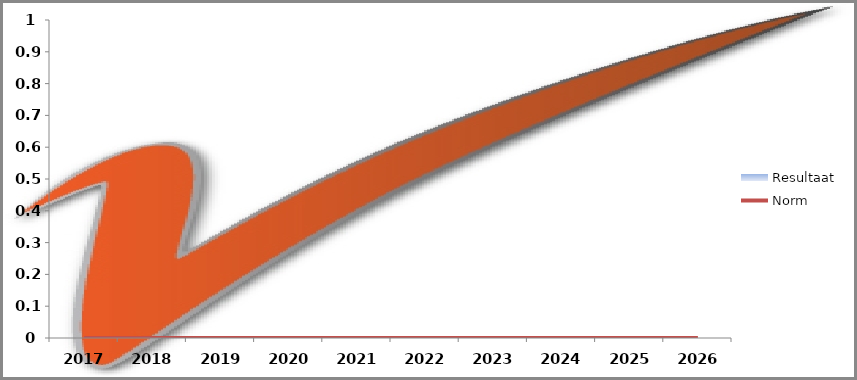
| Category | Resultaat |
|---|---|
| 2017.0 | 0 |
| 2018.0 | 0 |
| 2019.0 | 0 |
| 2020.0 | 0 |
| 2021.0 | 0 |
| 2022.0 | 0 |
| 2023.0 | 0 |
| 2024.0 | 0 |
| 2025.0 | 0 |
| 2026.0 | 0 |